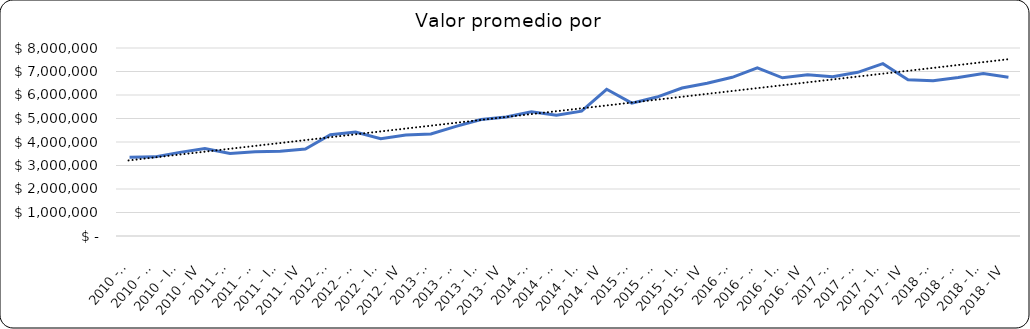
| Category | Valor m2 en Bogotá por sectores |
|---|---|
| 2010 - I | 3353603.604 |
| 2010 - II | 3367117.117 |
| 2010 - III | 3558558.559 |
| 2010 - IV | 3727477.477 |
| 2011 - I | 3513513.514 |
| 2011 - II | 3581081.081 |
| 2011 - III | 3601351.351 |
| 2011 - IV | 3698198.198 |
| 2012 - I | 4312354.312 |
| 2012 - II | 4428174.777 |
| 2012 - III | 4137529.138 |
| 2012 - IV | 4300314.685 |
| 2013 - I | 4339506.173 |
| 2013 - II | 4662962.963 |
| 2013 - III | 4956790.123 |
| 2013 - IV | 5061728.395 |
| 2014 - I | 5284273.983 |
| 2014 - II | 5135555.556 |
| 2014 - III | 5311111.111 |
| 2014 - IV | 6244444.444 |
| 2015 - I | 5654008.439 |
| 2015 - II | 5911392.405 |
| 2015 - III | 6295800.131 |
| 2015 - IV | 6500000 |
| 2016 - I | 6753812.636 |
| 2016 - II | 7154471.545 |
| 2016 - III | 6732426.304 |
| 2016 - IV | 6863289.76 |
| 2017 - I | 6781609.195 |
| 2017 - II | 6964205.817 |
| 2017 - III | 7333333.333 |
| 2017 - IV | 6647597.254 |
| 2018 - I | 6602941.176 |
| 2018 - II | 6744966.443 |
| 2018 - III | 6917808 |
| 2018 - IV | 6758621 |